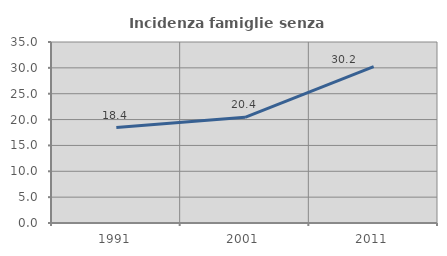
| Category | Incidenza famiglie senza nuclei |
|---|---|
| 1991.0 | 18.448 |
| 2001.0 | 20.444 |
| 2011.0 | 30.236 |